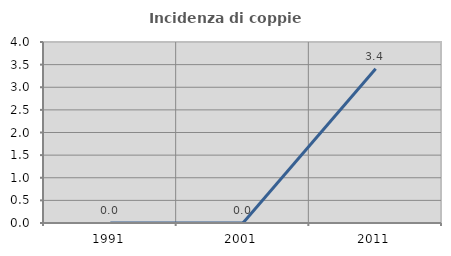
| Category | Incidenza di coppie miste |
|---|---|
| 1991.0 | 0 |
| 2001.0 | 0 |
| 2011.0 | 3.409 |